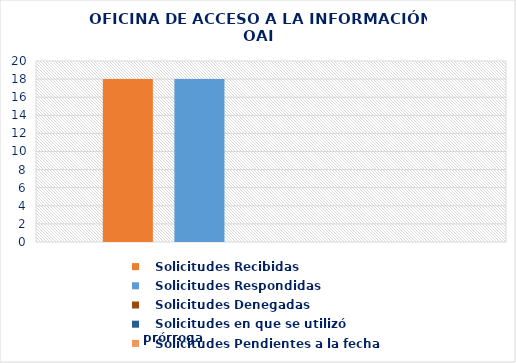
| Category |    Solicitudes Recibidas |    Solicitudes Respondidas |    Solicitudes Denegadas |    Solicitudes en que se utilizó prórroga |    Solicitudes Pendientes a la fecha |
|---|---|---|---|---|---|
| 0 | 18 | 18 | 0 | 0 | 0 |